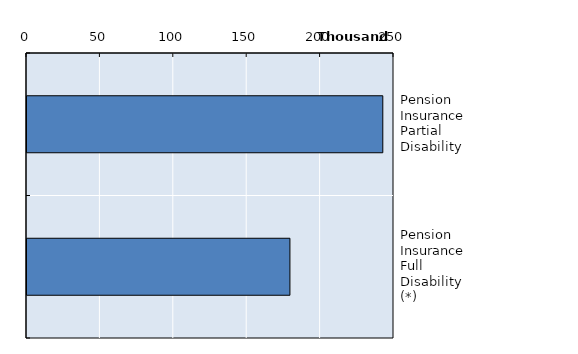
| Category | Series 0 |
|---|---|
| Pension Insurance Partial Disability | 242379 |
| Pension Insurance Full Disability (*) | 179108 |